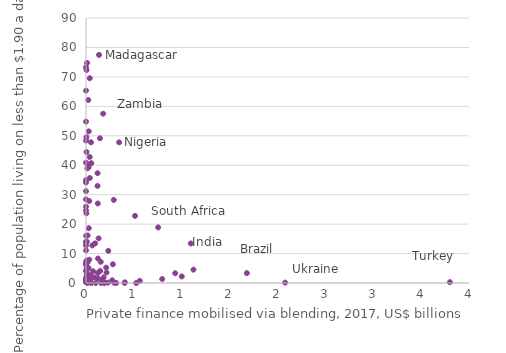
| Category | Series 0 |
|---|---|
| 5.41314395220381 | 0.85 |
| 0.0 | 0.346 |
| 33.48142519701852 | 27.854 |
| 92.29831175438846 | 1.863 |
| 524.5 | 0 |
| 131.4283436557953 | 15.155 |
| 101.23724702572721 | 0 |
| 0.0 | 13.846 |
| 4.502496054559802 | 49.554 |
| 0.0 | 1.657 |
| 2.538170736106414 | 6.354 |
| 21.726062495849643 | 0.201 |
| 66.0 | 12.78 |
| 1680.0471469104832 | 3.362 |
| 38.62082919062112 | 42.801 |
| 11.033123 | 74.732 |
| 1.2818769022658099 | 7.211 |
| 511.795957674163 | 22.791 |
| 0.0 | 34.138 |
| 24.630109345056923 | 1.297 |
| 562.091103729286 | 0.728 |
| 1122.3878949052512 | 4.533 |
| 0.0 | 34.939 |
| 126.57913186505263 | 1.516 |
| 289.7479910198073 | 28.207 |
| 5.536933622244441 | 72.323 |
| 29.014238597677828 | 18.602 |
| 42.883482 | 1.918 |
| 125.04751445947468 | 3.44 |
| 795.7480665428087 | 1.349 |
| 184.35950614045765 | 1.925 |
| 13.86 | 38.985 |
| 123.19174561382852 | 27.002 |
| 0.01739 | 0.959 |
| 147.3 | 4.073 |
| 0.30067 | 11.095 |
| 74.041723080167 | 3.973 |
| 232.75419299368437 | 10.918 |
| 33.571388 | 7.882 |
| 120.44912323300642 | 32.967 |
| 0.4641844211475594 | 65.34 |
| 0.0 | 6.496 |
| 4.60646 | 23.671 |
| 17.55925 | 16.16 |
| 1093.8578404812445 | 13.422 |
| 154.16161611852112 | 7.179 |
| 0.0 | 0.371 |
| 1000.0 | 2.228 |
| 29.25 | 1.836 |
| 406.00814534404236 | 0.236 |
| 157.7318002077008 | 0.019 |
| 120.65090388793071 | 37.287 |
| 41.874384158572596 | 0.352 |
| 8.998805291730513 | 2.536 |
| 9.252413956712884 | 14.029 |
| 190.49131753240897 | 0 |
| 0.0 | 54.802 |
| 21.053001053001054 | 40.186 |
| 135.83594221621013 | 77.465 |
| 39.400488843422394 | 69.556 |
| 54.0 | 0.012 |
| 0.0 | 4.08 |
| 52.074655032509725 | 47.794 |
| 0.0 | 6.245 |
| 45.0 | 0.398 |
| 931.708739223845 | 3.318 |
| 11.339189126102996 | 0.031 |
| 192.62041706125413 | 0.2 |
| 315.08737647954007 | 0 |
| 274.02309515161767 | 0.923 |
| 23.153617799606874 | 62.145 |
| 280.76304123884233 | 6.355 |
| 94.39941158088155 | 13.444 |
| 15.332859325893361 | 7.032 |
| 27.9400863205952 | 2.866 |
| 5.175343191297486 | 44.508 |
| 346.3329816569585 | 47.764 |
| 27.234505692706573 | 5.023 |
| 211.2068082636126 | 5.229 |
| 60.44661606695976 | 1.979 |
| 0.008812935857153805 | 28.412 |
| 60.660567393754945 | 1.891 |
| 214.32280972316542 | 3.555 |
| 125.1497371 | 8.316 |
| 28.898226274829195 | 51.496 |
| 1.66667 | 1.053 |
| 0.1054199075639725 | 25.948 |
| 40.10026181490249 | 35.651 |
| 292.70701300359605 | 0.103 |
| 15.0 | 1.007 |
| 0.5 | 48.391 |
| 0.0 | 24.685 |
| 753.618655963533 | 18.879 |
| 0.0 | 73.258 |
| 40.488623307497406 | 0.772 |
| 7.11456 | 7.665 |
| 7.085909142148575 | 4.814 |
| 55.506952134932035 | 40.69 |
| 403.0519600725622 | 0.026 |
| 0.02109 | 31.197 |
| 145.66770003381805 | 49.154 |
| 171.85490291640093 | 0.93 |
| 3800.6355086942795 | 0.281 |
| 10.616334122421373 | 2.778 |
| 26.39558320470394 | 39.242 |
| 2080.286760634298 | 0.12 |
| 228.22935531000002 | 0.125 |
| 0.0 | 14.006 |
| 0.008812935857153805 | 12.808 |
| 55.60165184487947 | 2.298 |
| 11.092099895164019 | 0.593 |
| 0.0 | 40.845 |
| 179.27865957645616 | 57.496 |
| 1.053001053001053 | 16.039 |